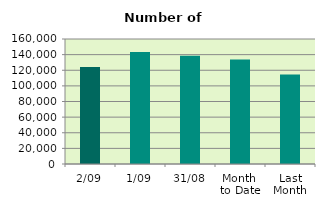
| Category | Series 0 |
|---|---|
| 2/09 | 124278 |
| 1/09 | 143308 |
| 31/08 | 138572 |
| Month 
to Date | 133793 |
| Last
Month | 114688 |